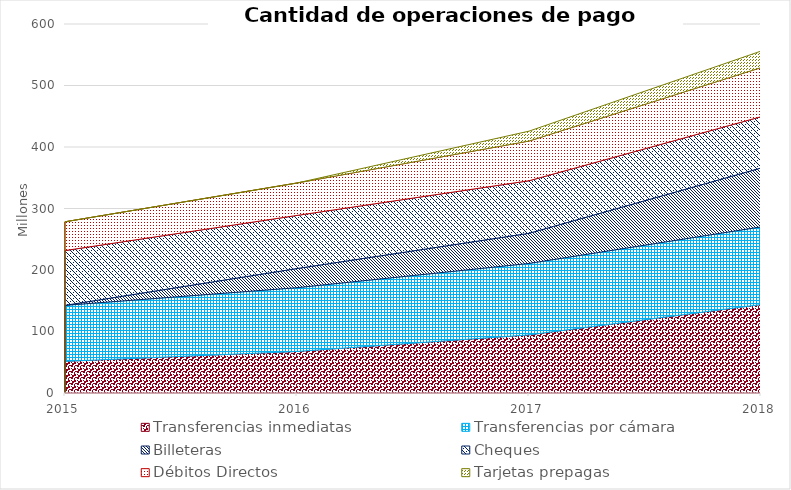
| Category | Transferencias inmediatas | Transferencias por cámara | Billeteras | Cheques | Débitos Directos | Tarjetas prepagas |
|---|---|---|---|---|---|---|
| 2015.0 | 51.491 | 91.051 | 0 | 89.05 | 46.792 | 0 |
| 2016.0 | 67.569 | 103.675 | 31.169 | 86.306 | 52.718 | 0 |
| 2017.0 | 94.525 | 116.178 | 48.979 | 85.421 | 64.59 | 16.071 |
| 2018.0 | 143.86 | 126.239 | 95.754 | 83.336 | 79.889 | 26.858 |